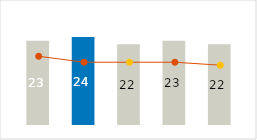
| Category | Power & Fuel |
|---|---|
| 0 | 23 |
| 1 | 24 |
| 2 | 22 |
| 3 | 23 |
| 4 | 22 |